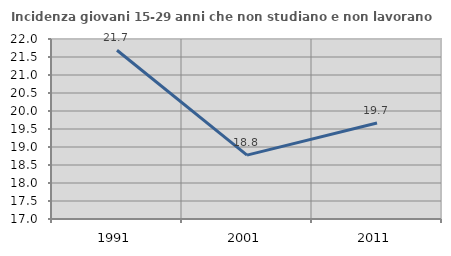
| Category | Incidenza giovani 15-29 anni che non studiano e non lavorano  |
|---|---|
| 1991.0 | 21.687 |
| 2001.0 | 18.774 |
| 2011.0 | 19.665 |